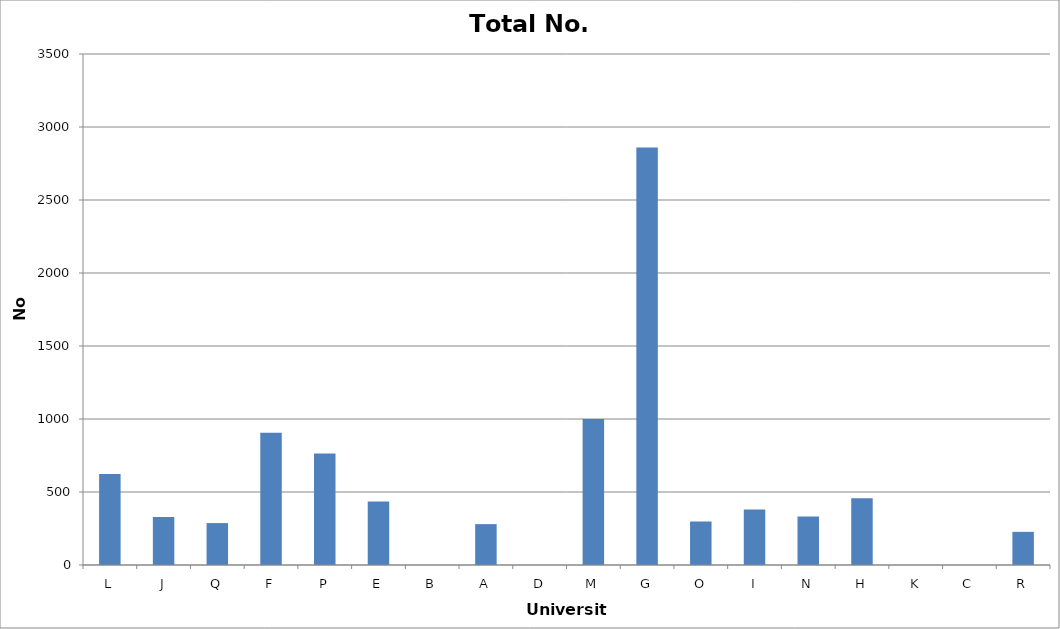
| Category | Total No. Referrals |
|---|---|
| L | 623 |
| J | 328 |
| Q | 287 |
| F | 906 |
| P | 764 |
| E | 435 |
| B | 0 |
| A | 280 |
| D | 0 |
| M | 1000 |
| G | 2860 |
| O | 298 |
| I | 380 |
| N | 332 |
| H | 458 |
| K | 0 |
| C | 0 |
| R | 227 |